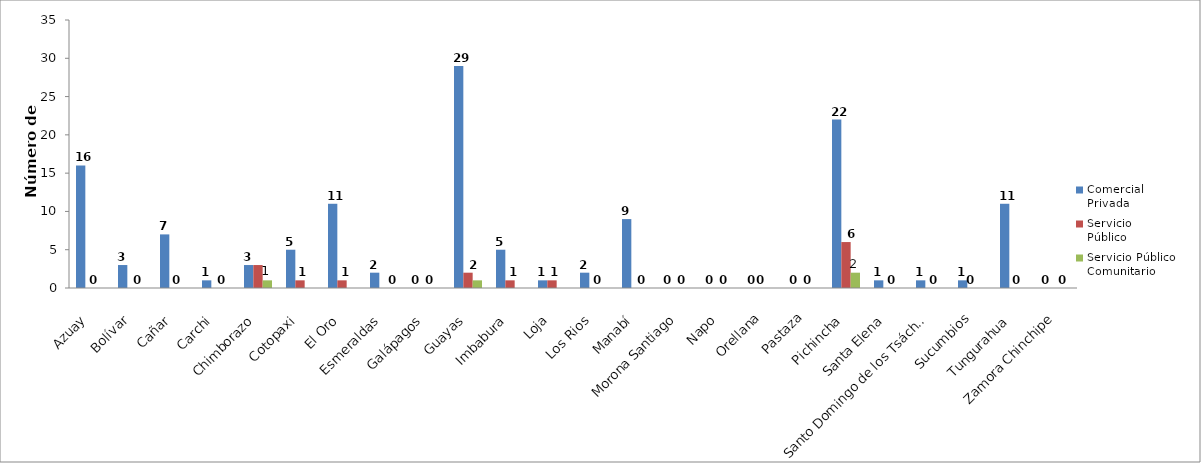
| Category | Comercial 
Privada | Servicio 
Público | Servicio Público
Comunitario |
|---|---|---|---|
| Azuay | 16 | 0 | 0 |
| Bolívar | 3 | 0 | 0 |
| Cañar | 7 | 0 | 0 |
| Carchi | 1 | 0 | 0 |
| Chimborazo | 3 | 3 | 1 |
| Cotopaxi | 5 | 1 | 0 |
| El Oro | 11 | 1 | 0 |
| Esmeraldas | 2 | 0 | 0 |
| Galápagos | 0 | 0 | 0 |
| Guayas | 29 | 2 | 1 |
| Imbabura | 5 | 1 | 0 |
| Loja | 1 | 1 | 0 |
| Los Rios | 2 | 0 | 0 |
| Manabí | 9 | 0 | 0 |
| Morona Santiago | 0 | 0 | 0 |
| Napo | 0 | 0 | 0 |
| Orellana | 0 | 0 | 0 |
| Pastaza | 0 | 0 | 0 |
| Pichincha | 22 | 6 | 2 |
| Santa Elena | 1 | 0 | 0 |
| Santo Domingo de los Tsáchilas | 1 | 0 | 0 |
| Sucumbios | 1 | 0 | 0 |
| Tungurahua | 11 | 0 | 0 |
| Zamora Chinchipe | 0 | 0 | 0 |